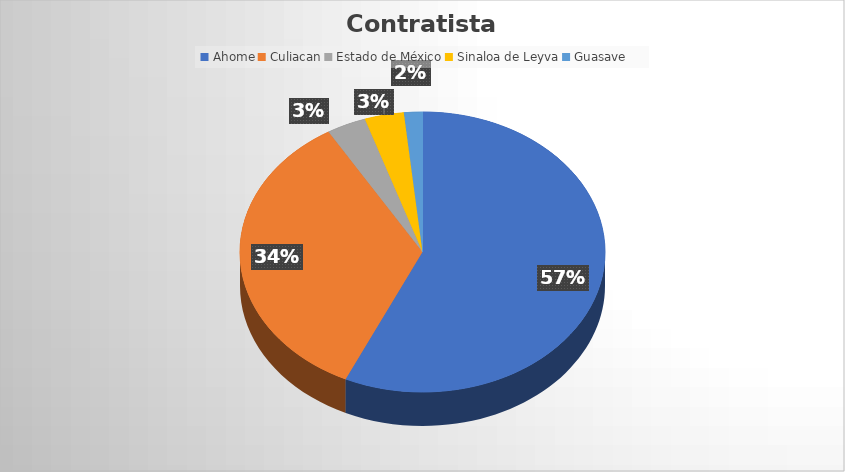
| Category | Suma |
|---|---|
| Ahome | 35699883.9 |
| Culiacan | 21640565.58 |
| Estado de México | 2185384.92 |
| Sinaloa de Leyva | 2185317.84 |
| Guasave | 1022459.78 |